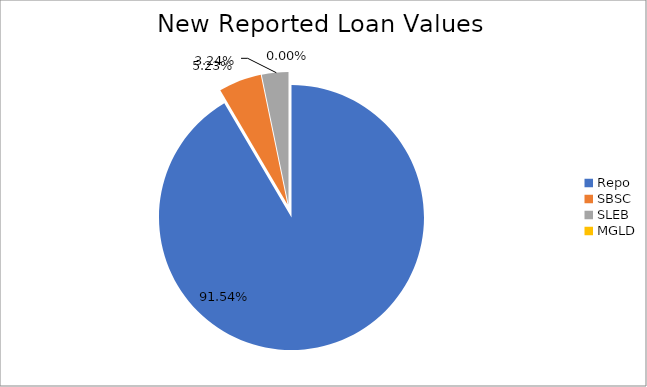
| Category | Series 0 |
|---|---|
| Repo | 12050044.792 |
| SBSC | 687980.151 |
| SLEB | 426115.559 |
| MGLD | 34.409 |